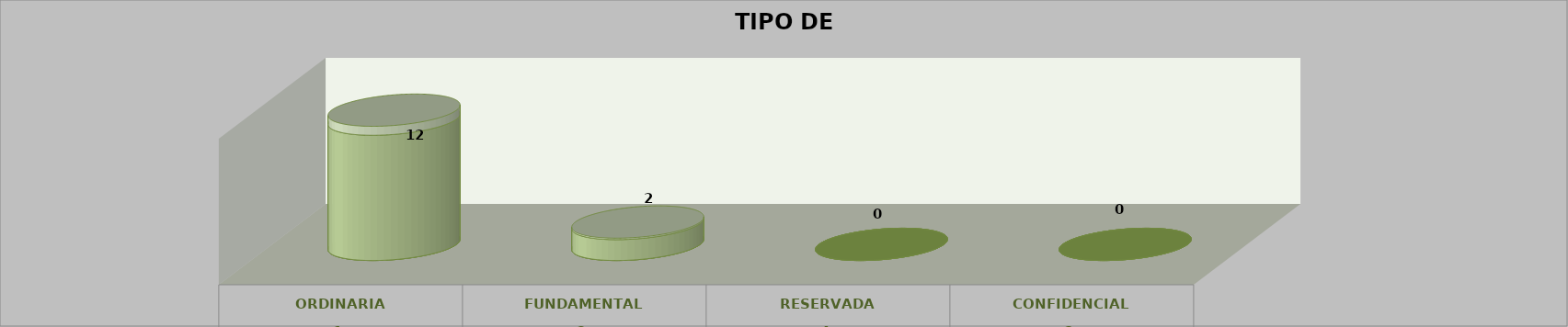
| Category | Series 0 | Series 2 | Series 1 | Series 3 | Series 4 |
|---|---|---|---|---|---|
| 0 |  |  |  | 12 | 0.86 |
| 1 |  |  |  | 2 | 0.14 |
| 2 |  |  |  | 0 | 0 |
| 3 |  |  |  | 0 | 0 |